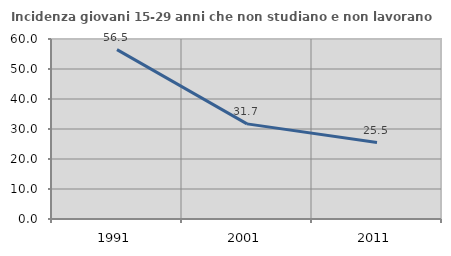
| Category | Incidenza giovani 15-29 anni che non studiano e non lavorano  |
|---|---|
| 1991.0 | 56.453 |
| 2001.0 | 31.707 |
| 2011.0 | 25.5 |